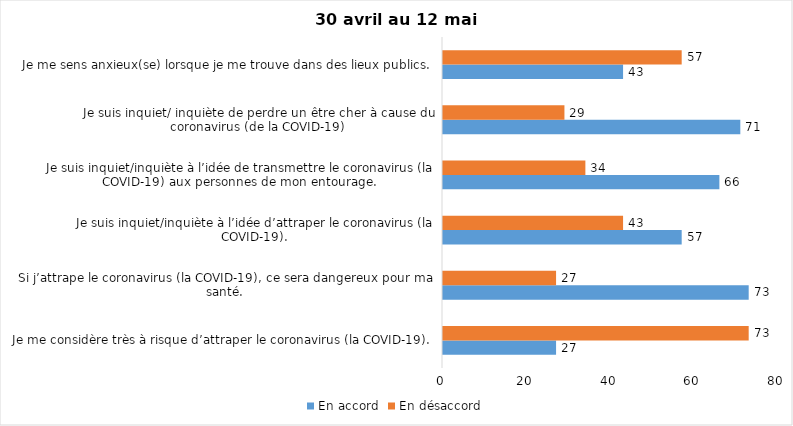
| Category | En accord | En désaccord |
|---|---|---|
| Je me considère très à risque d’attraper le coronavirus (la COVID-19). | 27 | 73 |
| Si j’attrape le coronavirus (la COVID-19), ce sera dangereux pour ma santé. | 73 | 27 |
| Je suis inquiet/inquiète à l’idée d’attraper le coronavirus (la COVID-19). | 57 | 43 |
| Je suis inquiet/inquiète à l’idée de transmettre le coronavirus (la COVID-19) aux personnes de mon entourage. | 66 | 34 |
| Je suis inquiet/ inquiète de perdre un être cher à cause du coronavirus (de la COVID-19) | 71 | 29 |
| Je me sens anxieux(se) lorsque je me trouve dans des lieux publics. | 43 | 57 |